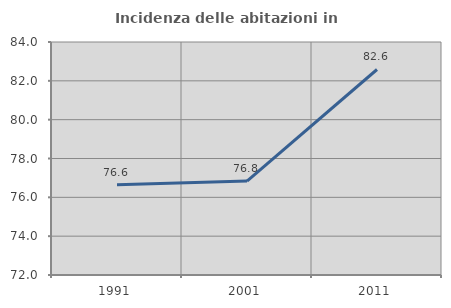
| Category | Incidenza delle abitazioni in proprietà  |
|---|---|
| 1991.0 | 76.65 |
| 2001.0 | 76.836 |
| 2011.0 | 82.584 |